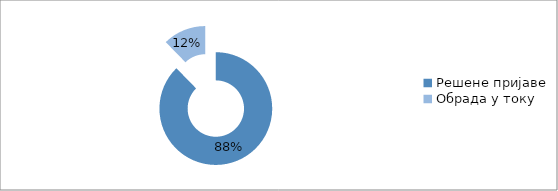
| Category | Series 0 |
|---|---|
| Решене пријаве | 12116 |
| Обрада у току | 1703 |